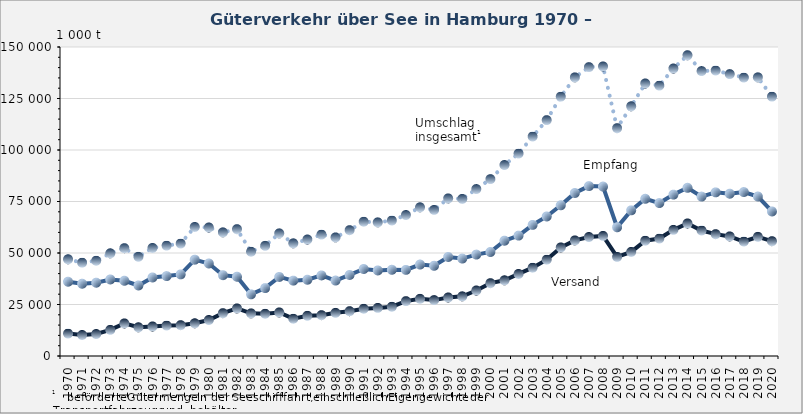
| Category | Umschlag insgesamt1 | Empfang | Versand |
|---|---|---|---|
| 1970.0 | 46959 | 36069 | 10890 |
| 1971.0 | 45303 | 35090 | 10213 |
| 1972.0 | 46255 | 35581 | 10674 |
| 1973.0 | 49850 | 37154 | 12696 |
| 1974.0 | 52349 | 36527 | 15822 |
| 1975.0 | 48181 | 34240 | 13941 |
| 1976.0 | 52460 | 38120 | 14340 |
| 1977.0 | 53574 | 38788 | 14786 |
| 1978.0 | 54596 | 39614 | 14982 |
| 1979.0 | 62650 | 46758 | 15892 |
| 1980.0 | 62393 | 44911 | 17482 |
| 1981.0 | 60027 | 39234 | 20793 |
| 1982.0 | 61581 | 38482 | 23099 |
| 1983.0 | 50631 | 29935 | 20696 |
| 1984.0 | 53488 | 32959 | 20529 |
| 1985.0 | 59535 | 38380 | 21155 |
| 1986.0 | 54696 | 36584 | 18112 |
| 1987.0 | 56570 | 37026 | 19544 |
| 1988.0 | 58942 | 39114 | 19828 |
| 1989.0 | 57582 | 36630 | 20952 |
| 1990.0 | 61098 | 39340 | 21758 |
| 1991.0 | 65204 | 42243 | 22961 |
| 1992.0 | 64881 | 41522 | 23359 |
| 1993.0 | 65772 | 41846 | 23926 |
| 1994.0 | 68439 | 41799 | 26640 |
| 1995.0 | 72189 | 44404 | 27785 |
| 1996.0 | 70920 | 43782 | 27138 |
| 1997.0 | 76503 | 48077 | 28426 |
| 1998.0 | 76264 | 47298 | 28966 |
| 1999.0 | 81036 | 49232 | 31805 |
| 2000.0 | 85863 | 50493 | 35370 |
| 2001.0 | 92709 | 55960 | 36749 |
| 2002.0 | 98272 | 58439 | 39833 |
| 2003.0 | 106536 | 63649 | 42887 |
| 2004.0 | 114501 | 67731 | 46770 |
| 2005.0 | 125894 | 73183 | 52711 |
| 2006.0 | 135259 | 79137 | 56122 |
| 2007.0 | 140236 | 82472 | 57764 |
| 2008.0 | 140562 | 82255 | 58307 |
| 2009.0 | 110604 | 62497 | 48107 |
| 2010.0 | 121222 | 70700 | 50522 |
| 2011.0 | 132293 | 76315 | 55978 |
| 2012.0 | 131269 | 74237 | 57033 |
| 2013.0 | 139573 | 78335 | 61238 |
| 2014.0 | 146000 | 81648 | 64352 |
| 2015.0 | 138311 | 77387 | 60925 |
| 2016.0 | 138585 | 79435 | 59151 |
| 2017.0 | 136839 | 78781 | 58057 |
| 2018.0 | 135163 | 79587 | 55577 |
| 2019.0 | 135271 | 77410 | 57860 |
| 2020.0 | 125911 | 70166 | 55745 |